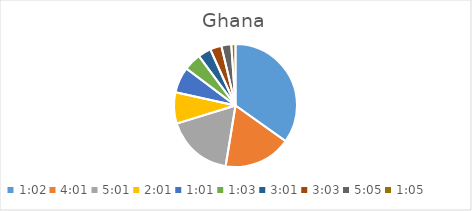
| Category | Series 0 |
|---|---|
| 0.04305555555555556 | 42.808 |
| 0.1673611111111111 | 21.795 |
| 0.20902777777777778 | 21.728 |
| 0.08402777777777777 | 10.091 |
| 0.042361111111111106 | 8.362 |
| 0.043750000000000004 | 5.648 |
| 0.12569444444444444 | 4.218 |
| 0.12708333333333333 | 3.696 |
| 0.21180555555555555 | 3.195 |
| 0.04513888888888889 | 1.362 |